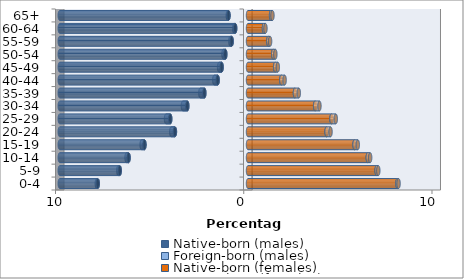
| Category | Native-born (males) | Foreign-born (males) | Native-born (females) | Foreign-born (females) |
|---|---|---|---|---|
| 0-4 | -7.981 | -0.052 | 7.936 | 0.062 |
| 5-9 | -6.814 | -0.077 | 6.833 | 0.09 |
| 10-14 | -6.345 | -0.108 | 6.362 | 0.128 |
| 15-19 | -5.5 | -0.15 | 5.659 | 0.174 |
| 20-24 | -3.882 | -0.194 | 4.174 | 0.211 |
| 25-29 | -4.13 | -0.225 | 4.434 | 0.23 |
| 30-34 | -3.224 | -0.235 | 3.567 | 0.229 |
| 35-39 | -2.319 | -0.213 | 2.493 | 0.206 |
| 40-44 | -1.612 | -0.179 | 1.77 | 0.176 |
| 45-49 | -1.401 | -0.134 | 1.442 | 0.143 |
| 50-54 | -1.205 | -0.098 | 1.338 | 0.115 |
| 55-59 | -0.867 | -0.071 | 1.079 | 0.095 |
| 60-64 | -0.681 | -0.054 | 0.849 | 0.079 |
| 65+ | -1.035 | -0.038 | 1.225 | 0.074 |